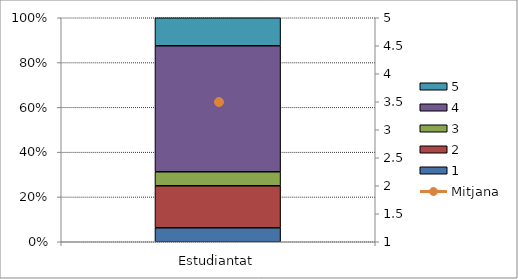
| Category | 1 | 2 | 3 | 4 | 5 |
|---|---|---|---|---|---|
| Estudiantat | 1 | 3 | 1 | 9 | 2 |